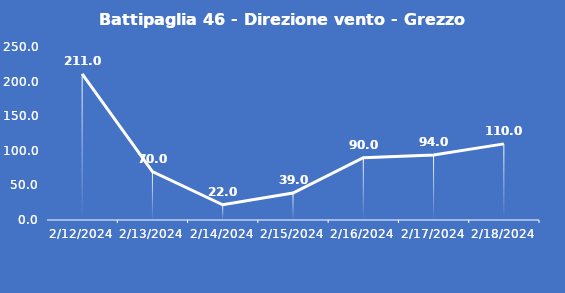
| Category | Battipaglia 46 - Direzione vento - Grezzo (°N) |
|---|---|
| 2/12/24 | 211 |
| 2/13/24 | 70 |
| 2/14/24 | 22 |
| 2/15/24 | 39 |
| 2/16/24 | 90 |
| 2/17/24 | 94 |
| 2/18/24 | 110 |